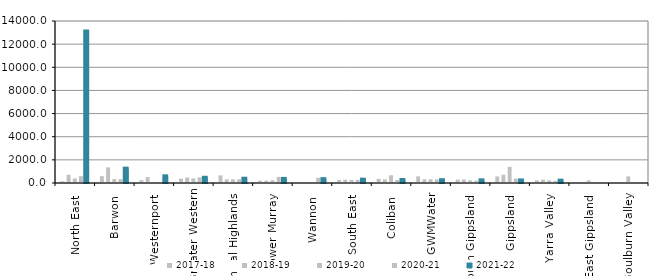
| Category | 2017-18 | 2018-19 | 2019-20 | 2020-21 | 2021-22 |
|---|---|---|---|---|---|
| North East  | 155.5 | 712 | 392.5 | 583.25 | 13095 |
| Barwon  | 585.6 | 1347.945 | 345.083 | 334.826 | 1242.6 |
| Westernport  | 245.017 | 514 | 0 | 0 | 576 |
| Greater Western | 373.583 | 475.051 | 401.994 | 483.884 | 451.467 |
| Central Highlands  | 659.531 | 318.077 | 313.271 | 323.513 | 370.114 |
| Lower Murray  | 201.727 | 198.3 | 245.333 | 524.667 | 354.667 |
| Wannon  | 0 | 0 | 0 | 452 | 331.5 |
| South East  | 266.076 | 284.41 | 266.36 | 270.865 | 289.01 |
| Coliban  | 356.278 | 314.824 | 672.278 | 253.429 | 261.095 |
| GWMWater | 575.059 | 315.294 | 324.871 | 310.133 | 241.673 |
| South Gippsland  | 291.943 | 305.667 | 221.684 | 196.137 | 230.574 |
| Gippsland  | 566.913 | 716.228 | 1397.562 | 377.339 | 218.181 |
| Yarra Valley  | 229.907 | 282.741 | 221.621 | 185.238 | 204.4 |
| East Gippsland  | 0 | 0 | 227.667 | 0 | 0 |
| Goulburn Valley  | 0 | 0 | 571 | 0 | 0 |